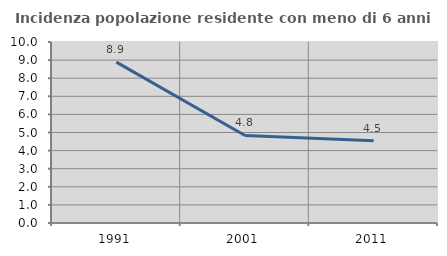
| Category | Incidenza popolazione residente con meno di 6 anni |
|---|---|
| 1991.0 | 8.887 |
| 2001.0 | 4.835 |
| 2011.0 | 4.543 |